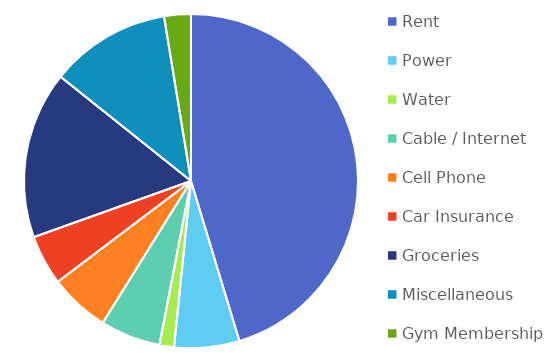
| Category | Series 0 |
|---|---|
| Rent | 7700 |
| Power | 1070 |
| Water | 240 |
| Cable / Internet | 990 |
| Cell Phone | 990 |
| Car Insurance | 825 |
| Groceries | 2750 |
| Miscellaneous | 1985 |
| Gym Membership | 440 |